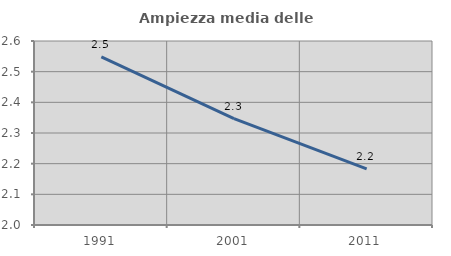
| Category | Ampiezza media delle famiglie |
|---|---|
| 1991.0 | 2.549 |
| 2001.0 | 2.347 |
| 2011.0 | 2.183 |